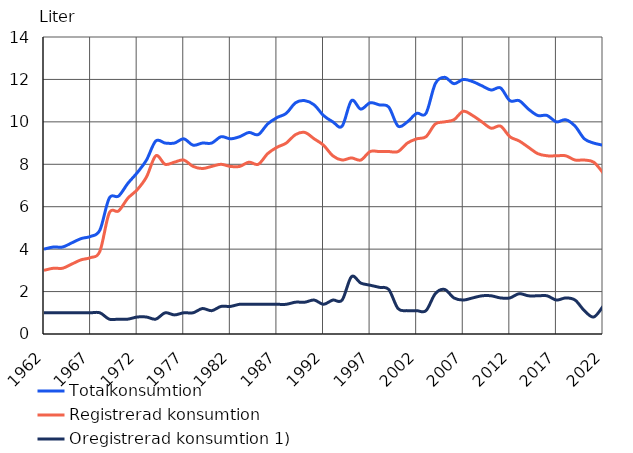
| Category | Totalkonsumtion  | Registrerad konsumtion | Oregistrerad konsumtion 1) |
|---|---|---|---|
| 1962.0 | 4 | 3 | 1 |
| 1963.0 | 4.1 | 3.1 | 1 |
| 1964.0 | 4.1 | 3.1 | 1 |
| 1965.0 | 4.3 | 3.3 | 1 |
| 1966.0 | 4.5 | 3.5 | 1 |
| 1967.0 | 4.6 | 3.6 | 1 |
| 1968.0 | 4.9 | 3.9 | 1 |
| 1969.0 | 6.4 | 5.7 | 0.7 |
| 1970.0 | 6.5 | 5.8 | 0.7 |
| 1971.0 | 7.1 | 6.4 | 0.7 |
| 1972.0 | 7.6 | 6.8 | 0.8 |
| 1973.0 | 8.2 | 7.4 | 0.8 |
| 1974.0 | 9.1 | 8.4 | 0.7 |
| 1975.0 | 9 | 8 | 1 |
| 1976.0 | 9 | 8.1 | 0.9 |
| 1977.0 | 9.2 | 8.2 | 1 |
| 1978.0 | 8.9 | 7.9 | 1 |
| 1979.0 | 9 | 7.8 | 1.2 |
| 1980.0 | 9 | 7.9 | 1.1 |
| 1981.0 | 9.3 | 8 | 1.3 |
| 1982.0 | 9.2 | 7.9 | 1.3 |
| 1983.0 | 9.3 | 7.9 | 1.4 |
| 1984.0 | 9.5 | 8.1 | 1.4 |
| 1985.0 | 9.4 | 8 | 1.4 |
| 1986.0 | 9.9 | 8.5 | 1.4 |
| 1987.0 | 10.2 | 8.8 | 1.4 |
| 1988.0 | 10.4 | 9 | 1.4 |
| 1989.0 | 10.9 | 9.4 | 1.5 |
| 1990.0 | 11 | 9.5 | 1.5 |
| 1991.0 | 10.8 | 9.2 | 1.6 |
| 1992.0 | 10.3 | 8.9 | 1.4 |
| 1993.0 | 10 | 8.4 | 1.6 |
| 1994.0 | 9.8 | 8.2 | 1.6 |
| 1995.0 | 11 | 8.3 | 2.7 |
| 1996.0 | 10.6 | 8.2 | 2.4 |
| 1997.0 | 10.9 | 8.6 | 2.3 |
| 1998.0 | 10.8 | 8.6 | 2.2 |
| 1999.0 | 10.7 | 8.6 | 2.1 |
| 2000.0 | 9.8 | 8.6 | 1.2 |
| 2001.0 | 10 | 9 | 1.1 |
| 2002.0 | 10.4 | 9.2 | 1.1 |
| 2003.0 | 10.4 | 9.3 | 1.1 |
| 2004.0 | 11.8 | 9.9 | 1.9 |
| 2005.0 | 12.1 | 10 | 2.1 |
| 2006.0 | 11.8 | 10.1 | 1.7 |
| 2007.0 | 12 | 10.5 | 1.6 |
| 2008.0 | 11.9 | 10.3 | 1.7 |
| 2009.0 | 11.7 | 10 | 1.8 |
| 2010.0 | 11.5 | 9.7 | 1.8 |
| 2011.0 | 11.6 | 9.8 | 1.7 |
| 2012.0 | 11 | 9.3 | 1.7 |
| 2013.0 | 11 | 9.1 | 1.9 |
| 2014.0 | 10.6 | 8.8 | 1.8 |
| 2015.0 | 10.3 | 8.5 | 1.8 |
| 2016.0 | 10.3 | 8.4 | 1.8 |
| 2017.0 | 10 | 8.4 | 1.6 |
| 2018.0 | 10.1 | 8.4 | 1.7 |
| 2019.0 | 9.8 | 8.2 | 1.6 |
| 2020.0 | 9.2 | 8.2 | 1.1 |
| 2021.0 | 9 | 8.1 | 0.8 |
| 2022.0 | 8.9 | 7.6 | 1.3 |